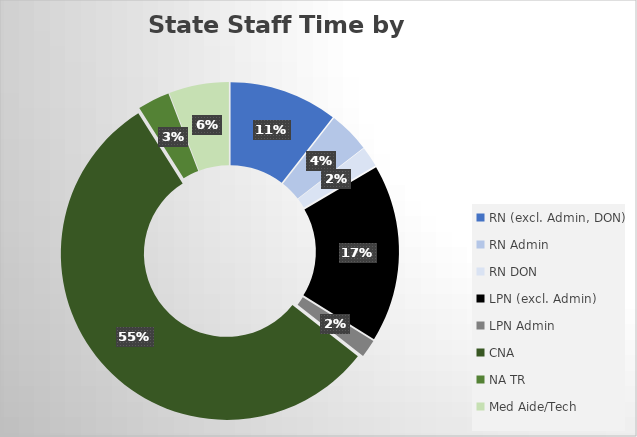
| Category | Series 0 |
|---|---|
| RN (excl. Admin, DON) | 3325.661 |
| RN Admin | 1263.451 |
| RN DON | 629.762 |
| LPN (excl. Admin) | 5458.219 |
| LPN Admin | 546.761 |
| CNA | 17496.102 |
| NA TR | 985.723 |
| Med Aide/Tech | 1841.795 |